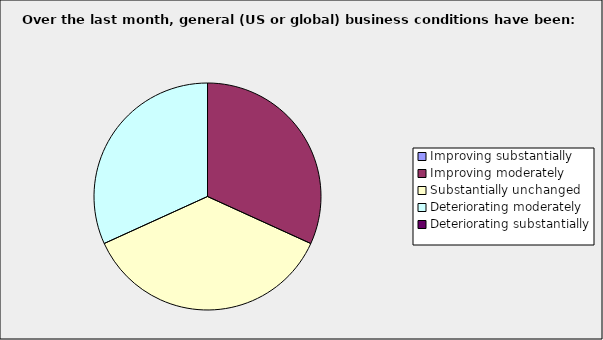
| Category | Series 0 |
|---|---|
| Improving substantially | 0 |
| Improving moderately | 0.318 |
| Substantially unchanged | 0.364 |
| Deteriorating moderately | 0.318 |
| Deteriorating substantially | 0 |